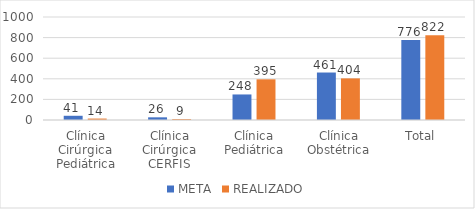
| Category | META | REALIZADO |
|---|---|---|
| Clínica Cirúrgica Pediátrica | 41 | 14 |
| Clínica Cirúrgica CERFIS | 26 | 9 |
| Clínica Pediátrica | 248 | 395 |
| Clínica Obstétrica | 461 | 404 |
| Total | 776 | 822 |